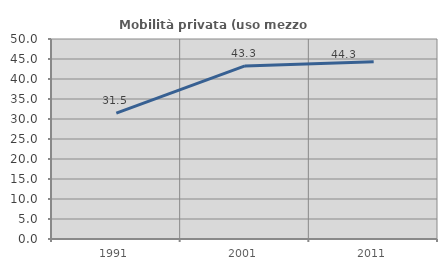
| Category | Mobilità privata (uso mezzo privato) |
|---|---|
| 1991.0 | 31.454 |
| 2001.0 | 43.265 |
| 2011.0 | 44.338 |